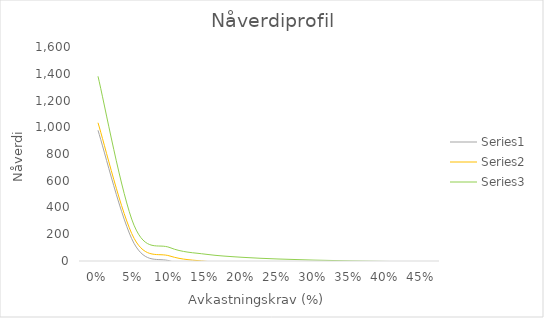
| Category | Series 1 | Series 2 | Series 3 |
|---|---|---|---|
| 0.0 | 977.103 | 1033.594 | 1380.95 |
| 0.05 | 132.231 | 170.492 | 267.659 |
| 0.1 | -0.033 | 37.135 | 100.007 |
| 0.15 | -39.982 | -2.729 | 50.335 |
| 0.2 | -58.246 | -20.838 | 27.792 |
| 0.25 | -68.658 | -31.121 | 14.969 |
| 0.3 | -75.385 | -37.747 | 6.685 |
| 0.35 | -80.089 | -42.371 | 0.885 |
| 0.4 | -83.564 | -45.782 | -3.407 |
| 0.45 | -86.234 | -48.4 | -6.712 |